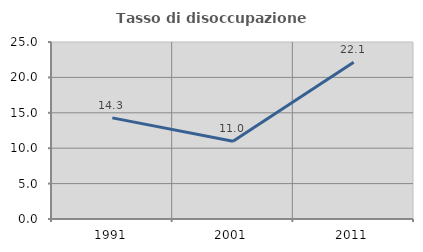
| Category | Tasso di disoccupazione giovanile  |
|---|---|
| 1991.0 | 14.286 |
| 2001.0 | 10.983 |
| 2011.0 | 22.143 |